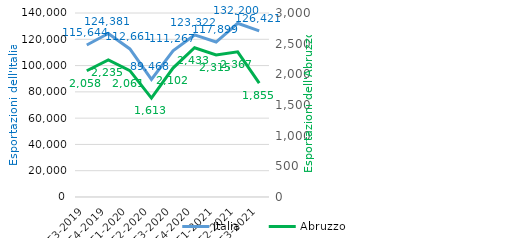
| Category | Italia |
|---|---|
| T3-2019 | 115643.531 |
| T4-2019 | 124381.053 |
| T1-2020 | 112660.733 |
| T2-2020 | 89468.132 |
| T3-2020 | 111267.087 |
| T4-2020 | 123321.887 |
| T1-2021 | 117898.949 |
| T2-2021 | 132200.24 |
| T3-2021 | 126421.009 |